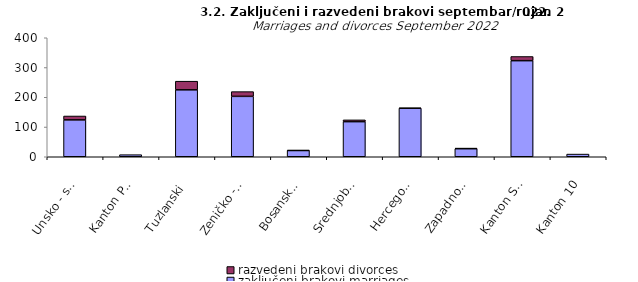
| Category | zaključeni brakovi marriages | razvedeni brakovi divorces |
|---|---|---|
| Unsko - sanski | 124 | 13 |
| Kanton Posavski | 7 | 0 |
| Tuzlanski | 225 | 29 |
| Zeničko - dobojski | 203 | 16 |
| Bosansko - podrinjski | 21 | 1 |
| Srednjobosanski | 118 | 6 |
| Hercegovačko-neretvanski | 163 | 1 |
| Zapadnohercegovački | 27 | 2 |
| Kanton Sarajevo | 323 | 14 |
| Kanton 10 | 9 | 0 |